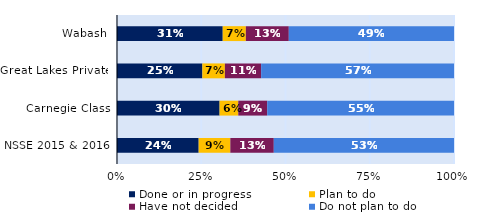
| Category | Done or in progress | Plan to do | Have not decided | Do not plan to do |
|---|---|---|---|---|
| Wabash | 0.314 | 0.069 | 0.127 | 0.49 |
| Great Lakes Private | 0.253 | 0.067 | 0.108 | 0.572 |
| Carnegie Class | 0.304 | 0.056 | 0.086 | 0.554 |
| NSSE 2015 & 2016 | 0.242 | 0.094 | 0.129 | 0.535 |